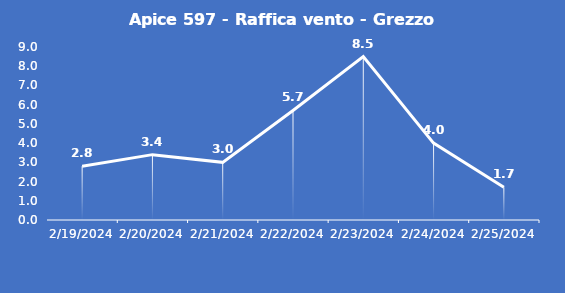
| Category | Apice 597 - Raffica vento - Grezzo (m/s) |
|---|---|
| 2/19/24 | 2.8 |
| 2/20/24 | 3.4 |
| 2/21/24 | 3 |
| 2/22/24 | 5.7 |
| 2/23/24 | 8.5 |
| 2/24/24 | 4 |
| 2/25/24 | 1.7 |